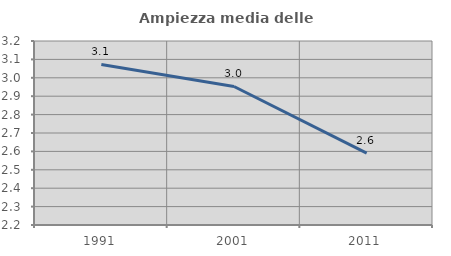
| Category | Ampiezza media delle famiglie |
|---|---|
| 1991.0 | 3.072 |
| 2001.0 | 2.953 |
| 2011.0 | 2.591 |